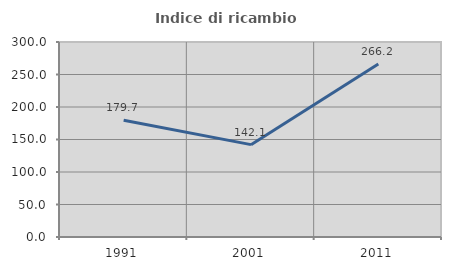
| Category | Indice di ricambio occupazionale  |
|---|---|
| 1991.0 | 179.695 |
| 2001.0 | 142.079 |
| 2011.0 | 266.187 |